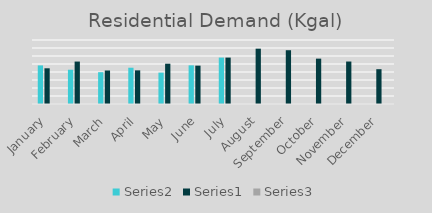
| Category | Series 1 | Series 0 | Series 2 |
|---|---|---|---|
| January | 48220 | 44639 | 1.08 |
| February | 42842.474 | 53057 | 0.807 |
| March | 39765.159 | 41882 | 0.949 |
| April | 45340.468 | 42057.867 | 1.078 |
| May | 39237.233 | 50377.601 | 0.779 |
| June | 48324.105 | 47943.133 | 1.008 |
| July | 58007.249 | 58007.249 | 1 |
| August | 0 | 69155.328 | 0 |
| September | 0 | 67226.815 | 0 |
| October | 0 | 56697.11 | 0 |
| November | 0 | 53097.198 | 0 |
| December | 0 | 43519.04 | 0 |